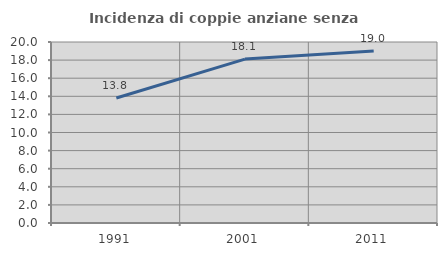
| Category | Incidenza di coppie anziane senza figli  |
|---|---|
| 1991.0 | 13.808 |
| 2001.0 | 18.113 |
| 2011.0 | 19.008 |